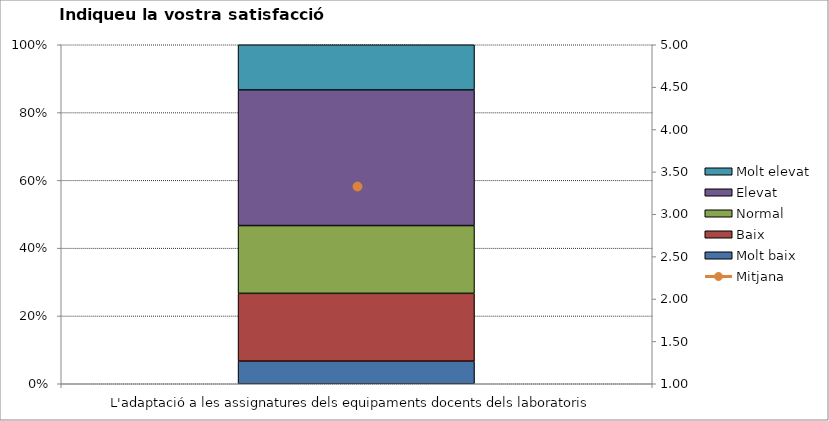
| Category | Molt baix | Baix | Normal  | Elevat | Molt elevat |
|---|---|---|---|---|---|
| L'adaptació a les assignatures dels equipaments docents dels laboratoris | 1 | 3 | 3 | 6 | 2 |